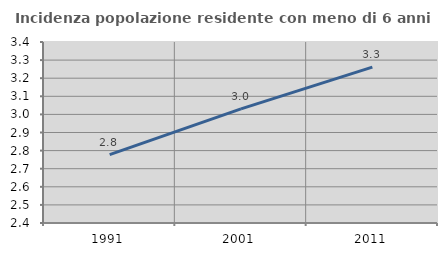
| Category | Incidenza popolazione residente con meno di 6 anni |
|---|---|
| 1991.0 | 2.778 |
| 2001.0 | 3.03 |
| 2011.0 | 3.261 |